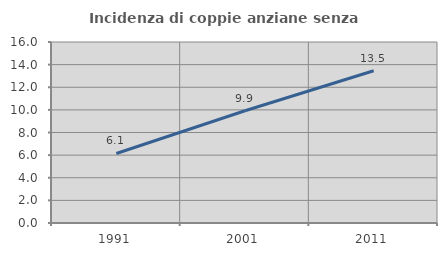
| Category | Incidenza di coppie anziane senza figli  |
|---|---|
| 1991.0 | 6.145 |
| 2001.0 | 9.925 |
| 2011.0 | 13.459 |